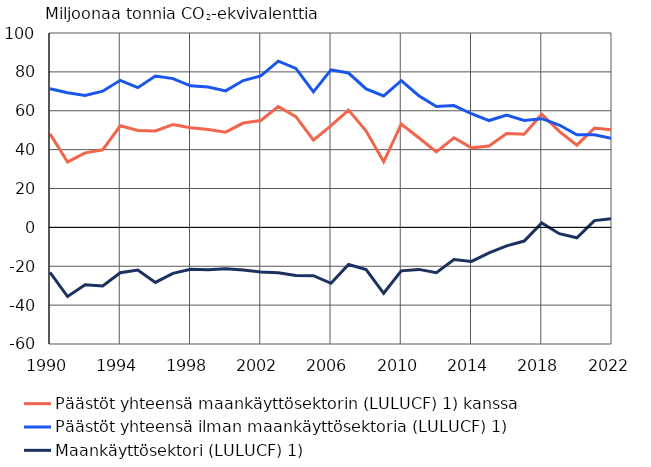
| Category | Päästöt yhteensä maankäyttösektorin (LULUCF) 1) kanssa | Päästöt yhteensä ilman maankäyttösektoria (LULUCF) 1) | Maankäyttösektori (LULUCF) 1) |
|---|---|---|---|
| 1990.0 | 48.156 | 71.331 | -23.175 |
| 1991.0 | 33.667 | 69.247 | -35.58 |
| 1992.0 | 38.322 | 67.869 | -29.547 |
| 1993.0 | 39.893 | 70.077 | -30.184 |
| 1994.0 | 52.275 | 75.646 | -23.37 |
| 1995.0 | 49.889 | 71.89 | -22 |
| 1996.0 | 49.574 | 77.881 | -28.307 |
| 1997.0 | 52.88 | 76.539 | -23.659 |
| 1998.0 | 51.253 | 72.846 | -21.594 |
| 1999.0 | 50.395 | 72.162 | -21.766 |
| 2000.0 | 48.962 | 70.22 | -21.258 |
| 2001.0 | 53.661 | 75.537 | -21.876 |
| 2002.0 | 54.986 | 77.935 | -22.949 |
| 2003.0 | 62.155 | 85.521 | -23.366 |
| 2004.0 | 56.969 | 81.757 | -24.788 |
| 2005.0 | 44.863 | 69.713 | -24.85 |
| 2006.0 | 52.338 | 81.085 | -28.748 |
| 2007.0 | 60.312 | 79.413 | -19.101 |
| 2008.0 | 49.578 | 71.26 | -21.682 |
| 2009.0 | 33.723 | 67.63 | -33.906 |
| 2010.0 | 53.09 | 75.468 | -22.378 |
| 2011.0 | 46.1 | 67.72 | -21.62 |
| 2012.0 | 38.835 | 62.177 | -23.342 |
| 2013.0 | 46.089 | 62.646 | -16.557 |
| 2014.0 | 40.92 | 58.461 | -17.541 |
| 2015.0 | 41.83 | 54.961 | -13.131 |
| 2016.0 | 48.318 | 57.81 | -9.493 |
| 2017.0 | 47.972 | 55.003 | -7.032 |
| 2018.0 | 58.258 | 55.934 | 2.324 |
| 2019.0 | 49.413 | 52.646 | -3.233 |
| 2020.0 | 42.299 | 47.654 | -5.354 |
| 2021.0 | 51.078 | 47.604 | 3.474 |
| 2022.0 | 50.143 | 45.7 | 4.443 |